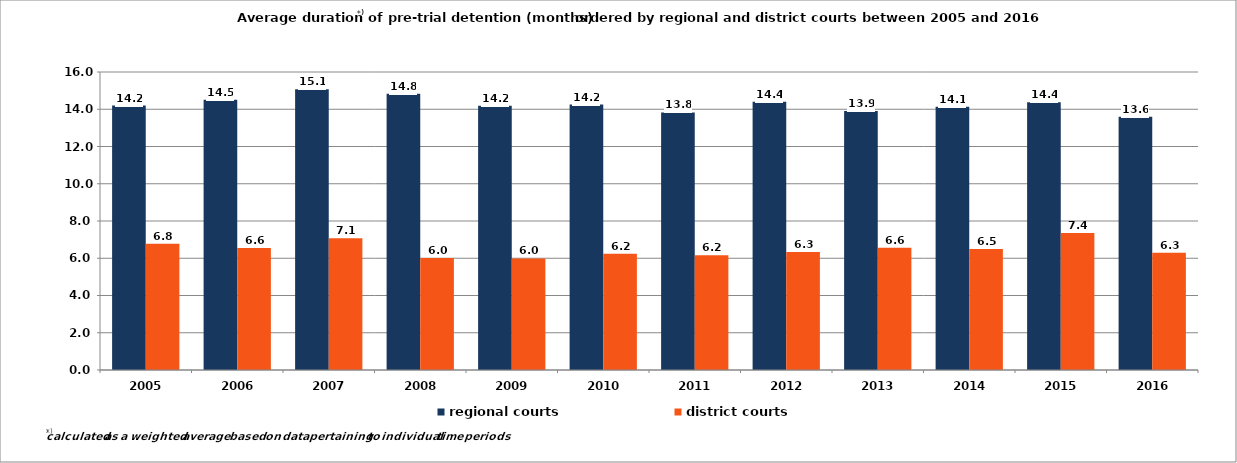
| Category | regional courts | district courts |
|---|---|---|
| 2005.0 | 14.2 | 6.775 |
| 2006.0 | 14.512 | 6.555 |
| 2007.0 | 15.076 | 7.076 |
| 2008.0 | 14.836 | 6.01 |
| 2009.0 | 14.191 | 5.991 |
| 2010.0 | 14.25 | 6.24 |
| 2011.0 | 13.83 | 6.165 |
| 2012.0 | 14.406 | 6.335 |
| 2013.0 | 13.901 | 6.564 |
| 2014.0 | 14.132 | 6.496 |
| 2015.0 | 14.37 | 7.354 |
| 2016.0 | 13.6 | 6.3 |